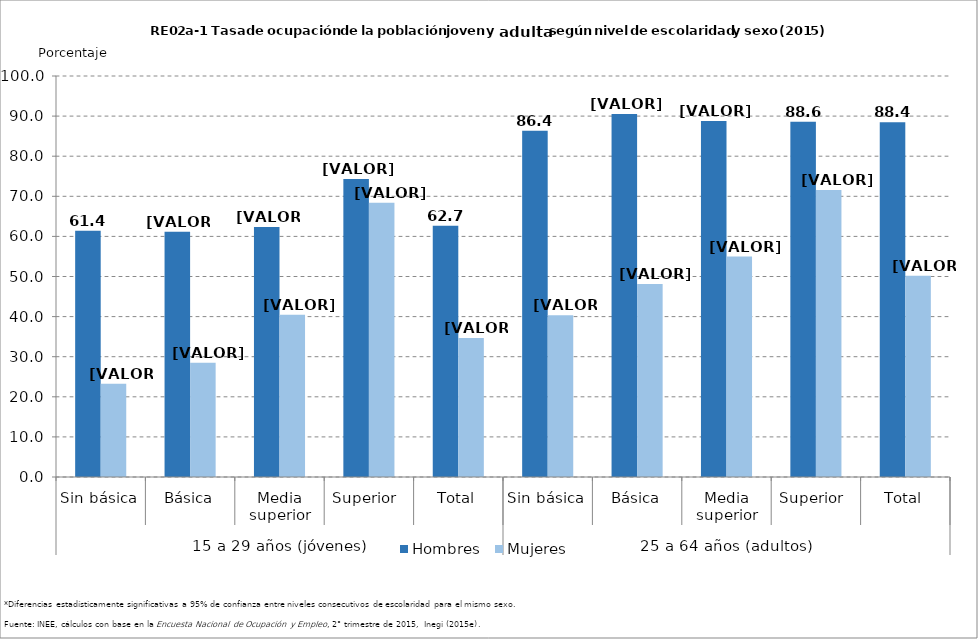
| Category | Hombres | Mujeres |
|---|---|---|
| 0 | 61.389 | 23.262 |
| 1 | 61.171 | 28.491 |
| 2 | 62.316 | 40.452 |
| 3 | 74.324 | 68.378 |
| 4 | 62.656 | 34.694 |
| 5 | 86.363 | 40.327 |
| 6 | 90.526 | 48.102 |
| 7 | 88.794 | 54.966 |
| 8 | 88.596 | 71.567 |
| 9 | 88.445 | 50.192 |